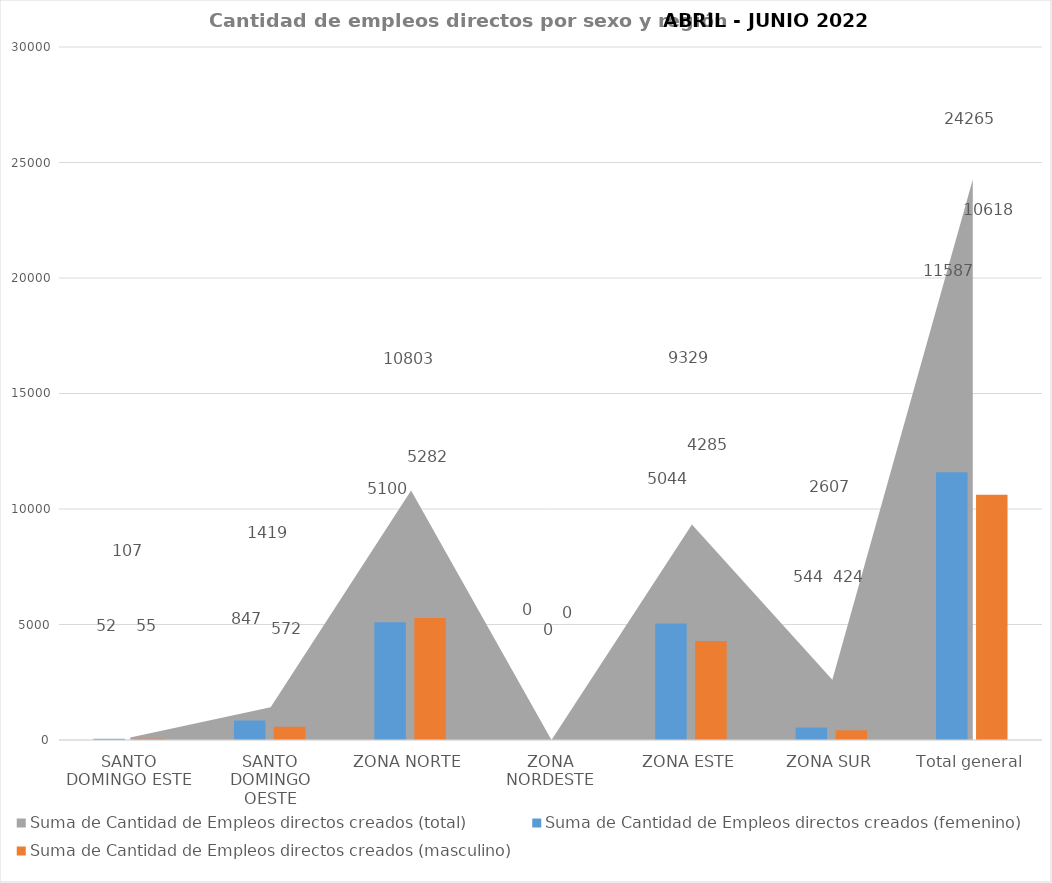
| Category | Suma de Cantidad de Empleos directos creados (femenino) | Suma de Cantidad de Empleos directos creados (masculino) |
|---|---|---|
| SANTO DOMINGO ESTE | 52 | 55 |
| SANTO DOMINGO OESTE | 847 | 572 |
| ZONA NORTE | 5100 | 5282 |
| ZONA NORDESTE | 0 | 0 |
| ZONA ESTE | 5044 | 4285 |
| ZONA SUR | 544 | 424 |
| Total general | 11587 | 10618 |